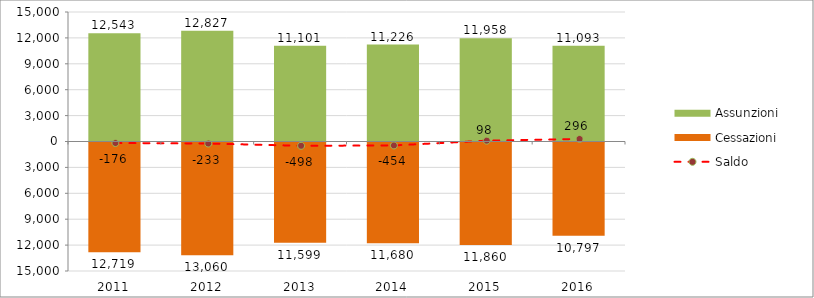
| Category | Assunzioni | Cessazioni |
|---|---|---|
| 2011.0 | 12543 | -12719 |
| 2012.0 | 12827 | -13060 |
| 2013.0 | 11101 | -11599 |
| 2014.0 | 11226 | -11680 |
| 2015.0 | 11958 | -11860 |
| 2016.0 | 11093 | -10797 |